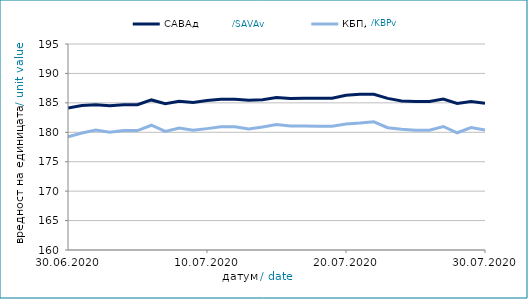
| Category | САВАд | КБПд |
|---|---|---|
| 2020-06-30 | 184.14 | 179.223 |
| 2020-07-01 | 184.532 | 179.882 |
| 2020-07-02 | 184.693 | 180.391 |
| 2020-07-03 | 184.497 | 180.008 |
| 2020-07-04 | 184.679 | 180.285 |
| 2020-07-05 | 184.683 | 180.292 |
| 2020-07-06 | 185.496 | 181.199 |
| 2020-07-07 | 184.86 | 180.148 |
| 2020-07-08 | 185.274 | 180.731 |
| 2020-07-09 | 185.067 | 180.367 |
| 2020-07-10 | 185.413 | 180.622 |
| 2020-07-11 | 185.607 | 180.92 |
| 2020-07-12 | 185.612 | 180.927 |
| 2020-07-13 | 185.432 | 180.553 |
| 2020-07-14 | 185.548 | 180.896 |
| 2020-07-15 | 185.91 | 181.319 |
| 2020-07-16 | 185.759 | 181.05 |
| 2020-07-17 | 185.799 | 181.077 |
| 2020-07-18 | 185.772 | 181.026 |
| 2020-07-19 | 185.776 | 181.033 |
| 2020-07-20 | 186.305 | 181.422 |
| 2020-07-21 | 186.482 | 181.568 |
| 2020-07-22 | 186.465 | 181.779 |
| 2020-07-23 | 185.756 | 180.778 |
| 2020-07-24 | 185.327 | 180.516 |
| 2020-07-25 | 185.227 | 180.359 |
| 2020-07-26 | 185.232 | 180.366 |
| 2020-07-27 | 185.663 | 180.987 |
| 2020-07-28 | 184.892 | 179.919 |
| 2020-07-29 | 185.236 | 180.795 |
| 2020-07-30 | 184.923 | 180.376 |